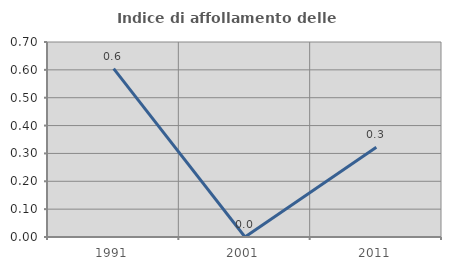
| Category | Indice di affollamento delle abitazioni  |
|---|---|
| 1991.0 | 0.604 |
| 2001.0 | 0 |
| 2011.0 | 0.323 |